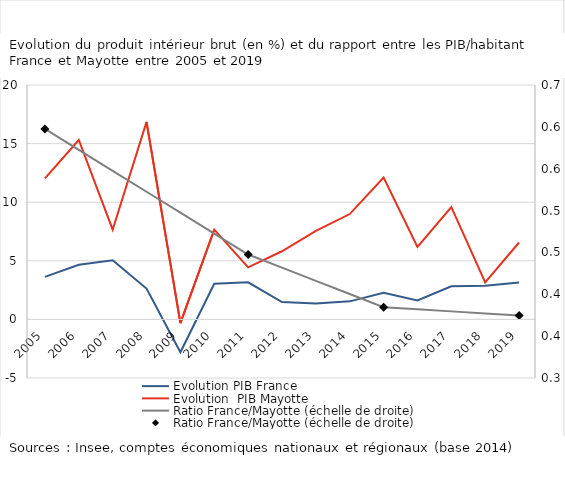
| Category | Evolution PIB France | Evolution  PIB Mayotte |
|---|---|---|
| 2005.0 | 3.632 | 12.039 |
| 2006.0 | 4.657 | 15.306 |
| 2007.0 | 5.043 | 7.655 |
| 2008.0 | 2.628 | 16.851 |
| 2009.0 | -2.809 | -0.313 |
| 2010.0 | 3.04 | 7.657 |
| 2011.0 | 3.161 | 4.441 |
| 2012.0 | 1.479 | 5.815 |
| 2013.0 | 1.359 | 7.546 |
| 2014.0 | 1.539 | 8.988 |
| 2015.0 | 2.264 | 12.103 |
| 2016.0 | 1.624 | 6.192 |
| 2017.0 | 2.825 | 9.585 |
| 2018.0 | 2.876 | 3.155 |
| 2019.0 | 3.145 | 6.561 |